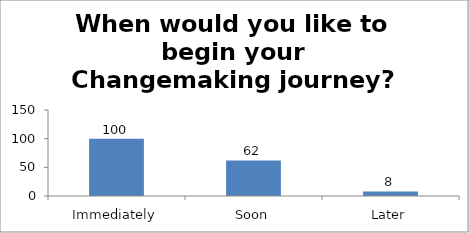
| Category | When would you like to begin your Changemaking journey?  |
|---|---|
| Immediately | 100 |
| Soon | 62 |
| Later | 8 |